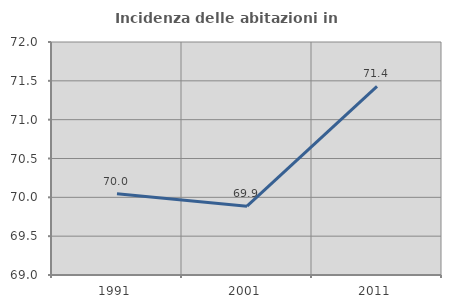
| Category | Incidenza delle abitazioni in proprietà  |
|---|---|
| 1991.0 | 70.047 |
| 2001.0 | 69.886 |
| 2011.0 | 71.429 |